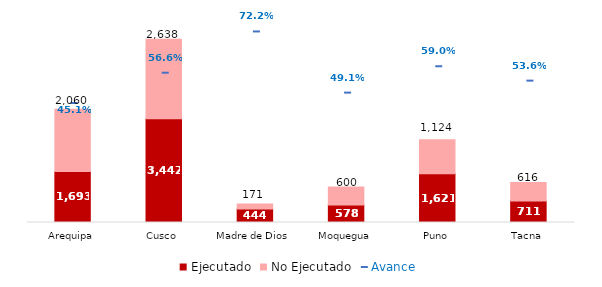
| Category | Ejecutado | No Ejecutado |
|---|---|---|
| Arequipa | 1693.288 | 2059.975 |
| Cusco | 3441.613 | 2638.187 |
| Madre de Dios | 444.443 | 170.73 |
| Moquegua | 577.856 | 600.044 |
| Puno | 1621.212 | 1124.419 |
| Tacna | 711.404 | 615.848 |